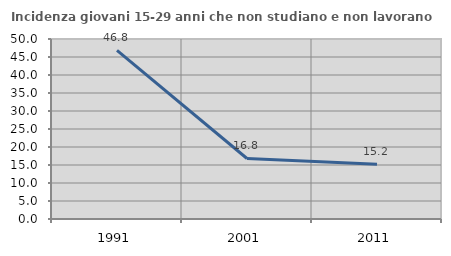
| Category | Incidenza giovani 15-29 anni che non studiano e non lavorano  |
|---|---|
| 1991.0 | 46.825 |
| 2001.0 | 16.807 |
| 2011.0 | 15.177 |